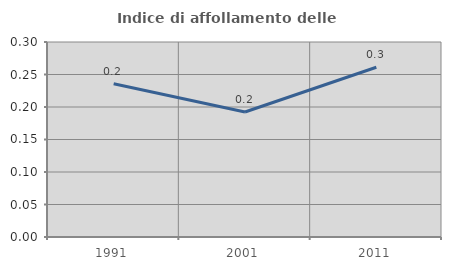
| Category | Indice di affollamento delle abitazioni  |
|---|---|
| 1991.0 | 0.236 |
| 2001.0 | 0.192 |
| 2011.0 | 0.261 |